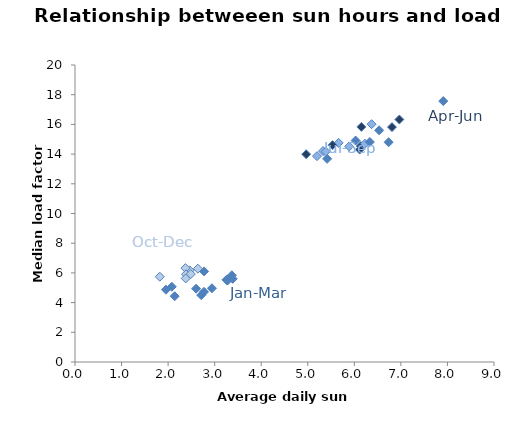
| Category | Series 0 |
|---|---|
| 6.967222329410398 | 16.331 |
| 5.32676738882561 | 14.205 |
| 2.4630795160316814 | 6.173 |
| 3.3688072999861167 | 5.839 |
| 4.966581096016139 | 13.992 |
| 5.3863345228003725 | 14.168 |
| 2.3724516449709 | 6.322 |
| 2.1409992476896385 | 4.43 |
| 6.137354795316249 | 14.541 |
| 6.370754977737338 | 16.015 |
| 2.3845848554237157 | 5.904 |
| 3.2721502536950755 | 5.542 |
| 6.115370138137039 | 14.306 |
| 6.1520707250955695 | 15.833 |
| 2.487225426234872 | 5.922 |
| 3.2759100610175564 | 5.485 |
| 6.808876871217255 | 15.82 |
| 5.663107392138812 | 14.754 |
| 1.822369497669558 | 5.742 |
| 2.941526110637134 | 4.965 |
| 5.532361392223429 | 14.604 |
| 5.88926686469665 | 14.516 |
| 2.638823681392684 | 6.284 |
| 2.7106289228147253 | 4.502 |
| 6.2275537754451005 | 14.7 |
| 5.197755143423477 | 13.863 |
| 2.3775910844841563 | 5.629 |
| 2.772244362742659 | 4.725 |
| 6.736438638862336 | 14.8 |
| 6.532311749968212 | 15.6 |
| 2.7728147939403085 | 6.1 |
| 3.3882010762184915 | 5.6 |
| 6.027520922093358 | 14.911 |
| 6.331892650340337 | 14.816 |
| 2.079024361143101 | 5.067 |
| 3.25376933491595 | 5.533 |
| 7.910158336126936 | 17.57 |
| 5.41538401233105 | 13.681 |
| 1.9539816125822809 | 4.87 |
| 2.6012993833713995 | 4.937 |